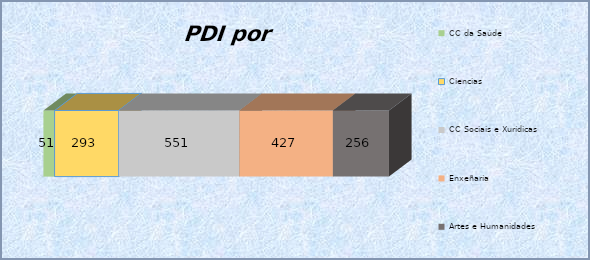
| Category | CC da Saúde | Ciencias | CC Sociais e Xurídicas | Enxeñaría | Artes e Humanidades |
|---|---|---|---|---|---|
| 0 | 51 | 293 | 551 | 427 | 256 |